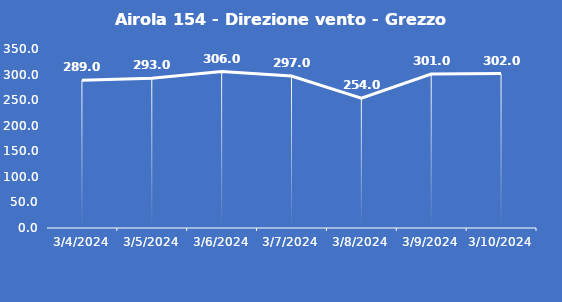
| Category | Airola 154 - Direzione vento - Grezzo (°N) |
|---|---|
| 3/4/24 | 289 |
| 3/5/24 | 293 |
| 3/6/24 | 306 |
| 3/7/24 | 297 |
| 3/8/24 | 254 |
| 3/9/24 | 301 |
| 3/10/24 | 302 |